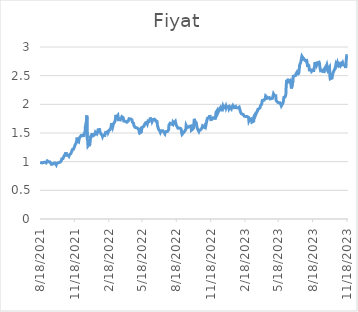
| Category | Fiyat |
|---|---|
| 8/18/21 | 0.988 |
| 8/20/21 | 0.982 |
| 8/23/21 | 0.978 |
| 8/24/21 | 0.989 |
| 8/25/21 | 0.993 |
| 8/26/21 | 0.986 |
| 8/27/21 | 0.979 |
| 8/31/21 | 0.991 |
| 9/1/21 | 0.984 |
| 9/2/21 | 0.992 |
| 9/3/21 | 0.979 |
| 9/6/21 | 1.014 |
| 9/7/21 | 1.01 |
| 9/8/21 | 0.998 |
| 9/9/21 | 0.999 |
| 9/13/21 | 0.996 |
| 9/14/21 | 0.993 |
| 9/15/21 | 0.993 |
| 9/17/21 | 0.953 |
| 9/20/21 | 0.954 |
| 9/21/21 | 0.957 |
| 9/22/21 | 0.964 |
| 9/23/21 | 0.974 |
| 9/24/21 | 0.968 |
| 9/27/21 | 0.977 |
| 9/28/21 | 0.988 |
| 9/29/21 | 0.981 |
| 9/30/21 | 0.945 |
| 10/1/21 | 0.967 |
| 10/4/21 | 0.978 |
| 10/5/21 | 0.983 |
| 10/6/21 | 0.983 |
| 10/7/21 | 0.984 |
| 10/8/21 | 0.988 |
| 10/11/21 | 0.994 |
| 10/12/21 | 0.997 |
| 10/13/21 | 1 |
| 10/14/21 | 1.023 |
| 10/15/21 | 1.05 |
| 10/18/21 | 1.053 |
| 10/19/21 | 1.053 |
| 10/20/21 | 1.083 |
| 10/21/21 | 1.102 |
| 10/22/21 | 1.093 |
| 10/25/21 | 1.14 |
| 10/26/21 | 1.164 |
| 10/27/21 | 1.111 |
| 10/28/21 | 1.113 |
| 11/1/21 | 1.113 |
| 11/2/21 | 1.114 |
| 11/3/21 | 1.094 |
| 11/4/21 | 1.099 |
| 11/5/21 | 1.126 |
| 11/8/21 | 1.138 |
| 11/9/21 | 1.151 |
| 11/10/21 | 1.147 |
| 11/11/21 | 1.186 |
| 11/12/21 | 1.21 |
| 11/15/21 | 1.215 |
| 11/16/21 | 1.216 |
| 11/17/21 | 1.23 |
| 11/18/21 | 1.263 |
| 11/19/21 | 1.287 |
| 11/22/21 | 1.32 |
| 11/23/21 | 1.316 |
| 11/24/21 | 1.367 |
| 11/25/21 | 1.42 |
| 11/26/21 | 1.36 |
| 11/29/21 | 1.346 |
| 11/30/21 | 1.388 |
| 12/1/21 | 1.415 |
| 12/2/21 | 1.431 |
| 12/3/21 | 1.431 |
| 12/6/21 | 1.458 |
| 12/7/21 | 1.462 |
| 12/8/21 | 1.464 |
| 12/9/21 | 1.452 |
| 12/10/21 | 1.443 |
| 12/13/21 | 1.455 |
| 12/14/21 | 1.506 |
| 12/15/21 | 1.479 |
| 12/16/21 | 1.505 |
| 12/17/21 | 1.607 |
| 12/20/21 | 1.714 |
| 12/21/21 | 1.807 |
| 12/22/21 | 1.41 |
| 12/23/21 | 1.367 |
| 12/24/21 | 1.274 |
| 12/27/21 | 1.302 |
| 12/28/21 | 1.271 |
| 12/29/21 | 1.319 |
| 12/30/21 | 1.35 |
| 12/31/21 | 1.434 |
| 1/3/22 | 1.476 |
| 1/4/22 | 1.484 |
| 1/5/22 | 1.46 |
| 1/6/22 | 1.476 |
| 1/7/22 | 1.452 |
| 1/10/22 | 1.465 |
| 1/11/22 | 1.474 |
| 1/12/22 | 1.491 |
| 1/13/22 | 1.514 |
| 1/14/22 | 1.498 |
| 1/17/22 | 1.485 |
| 1/18/22 | 1.484 |
| 1/19/22 | 1.517 |
| 1/20/22 | 1.556 |
| 1/21/22 | 1.573 |
| 1/24/22 | 1.56 |
| 1/25/22 | 1.523 |
| 1/26/22 | 1.537 |
| 1/27/22 | 1.534 |
| 1/28/22 | 1.483 |
| 1/31/22 | 1.461 |
| 2/1/22 | 1.441 |
| 2/2/22 | 1.46 |
| 2/3/22 | 1.462 |
| 2/4/22 | 1.453 |
| 2/7/22 | 1.458 |
| 2/8/22 | 1.489 |
| 2/9/22 | 1.508 |
| 2/10/22 | 1.505 |
| 2/11/22 | 1.516 |
| 2/14/22 | 1.5 |
| 2/15/22 | 1.542 |
| 2/16/22 | 1.514 |
| 2/17/22 | 1.53 |
| 2/18/22 | 1.545 |
| 2/21/22 | 1.555 |
| 2/22/22 | 1.554 |
| 2/23/22 | 1.587 |
| 2/24/22 | 1.609 |
| 2/25/22 | 1.67 |
| 2/28/22 | 1.604 |
| 3/1/22 | 1.606 |
| 3/2/22 | 1.657 |
| 3/3/22 | 1.669 |
| 3/4/22 | 1.677 |
| 3/7/22 | 1.716 |
| 3/8/22 | 1.73 |
| 3/9/22 | 1.815 |
| 3/10/22 | 1.779 |
| 3/11/22 | 1.794 |
| 3/14/22 | 1.809 |
| 3/15/22 | 1.748 |
| 3/16/22 | 1.728 |
| 3/17/22 | 1.709 |
| 3/18/22 | 1.748 |
| 3/21/22 | 1.735 |
| 3/22/22 | 1.757 |
| 3/23/22 | 1.727 |
| 3/24/22 | 1.742 |
| 3/25/22 | 1.783 |
| 3/28/22 | 1.77 |
| 3/29/22 | 1.744 |
| 3/30/22 | 1.708 |
| 3/31/22 | 1.714 |
| 4/1/22 | 1.716 |
| 4/4/22 | 1.704 |
| 4/5/22 | 1.693 |
| 4/6/22 | 1.687 |
| 4/7/22 | 1.688 |
| 4/8/22 | 1.693 |
| 4/11/22 | 1.707 |
| 4/12/22 | 1.723 |
| 4/13/22 | 1.749 |
| 4/14/22 | 1.752 |
| 4/15/22 | 1.742 |
| 4/18/22 | 1.744 |
| 4/19/22 | 1.75 |
| 4/20/22 | 1.726 |
| 4/21/22 | 1.725 |
| 4/22/22 | 1.691 |
| 4/25/22 | 1.67 |
| 4/26/22 | 1.632 |
| 4/27/22 | 1.626 |
| 4/28/22 | 1.618 |
| 4/29/22 | 1.599 |
| 5/5/22 | 1.588 |
| 5/6/22 | 1.572 |
| 5/9/22 | 1.564 |
| 5/10/22 | 1.532 |
| 5/11/22 | 1.527 |
| 5/12/22 | 1.55 |
| 5/13/22 | 1.504 |
| 5/16/22 | 1.517 |
| 5/17/22 | 1.566 |
| 5/18/22 | 1.598 |
| 5/20/22 | 1.597 |
| 5/23/22 | 1.619 |
| 5/24/22 | 1.611 |
| 5/25/22 | 1.655 |
| 5/26/22 | 1.671 |
| 5/27/22 | 1.677 |
| 5/30/22 | 1.685 |
| 5/31/22 | 1.682 |
| 6/1/22 | 1.657 |
| 6/2/22 | 1.674 |
| 6/3/22 | 1.709 |
| 6/6/22 | 1.703 |
| 6/7/22 | 1.72 |
| 6/8/22 | 1.737 |
| 6/9/22 | 1.768 |
| 6/10/22 | 1.747 |
| 6/13/22 | 1.737 |
| 6/14/22 | 1.704 |
| 6/15/22 | 1.687 |
| 6/16/22 | 1.733 |
| 6/17/22 | 1.749 |
| 6/20/22 | 1.741 |
| 6/21/22 | 1.738 |
| 6/22/22 | 1.748 |
| 6/23/22 | 1.724 |
| 6/24/22 | 1.704 |
| 6/27/22 | 1.7 |
| 6/28/22 | 1.638 |
| 6/29/22 | 1.61 |
| 6/30/22 | 1.602 |
| 7/1/22 | 1.566 |
| 7/4/22 | 1.541 |
| 7/5/22 | 1.545 |
| 7/6/22 | 1.509 |
| 7/7/22 | 1.521 |
| 7/8/22 | 1.537 |
| 7/13/22 | 1.538 |
| 7/14/22 | 1.54 |
| 7/18/22 | 1.486 |
| 7/19/22 | 1.512 |
| 7/20/22 | 1.52 |
| 7/21/22 | 1.523 |
| 7/22/22 | 1.528 |
| 7/25/22 | 1.527 |
| 7/26/22 | 1.512 |
| 7/27/22 | 1.535 |
| 7/28/22 | 1.556 |
| 7/29/22 | 1.639 |
| 8/1/22 | 1.67 |
| 8/2/22 | 1.677 |
| 8/3/22 | 1.661 |
| 8/4/22 | 1.658 |
| 8/5/22 | 1.668 |
| 8/8/22 | 1.645 |
| 8/9/22 | 1.696 |
| 8/10/22 | 1.689 |
| 8/11/22 | 1.694 |
| 8/12/22 | 1.676 |
| 8/15/22 | 1.703 |
| 8/16/22 | 1.673 |
| 8/17/22 | 1.659 |
| 8/18/22 | 1.631 |
| 8/19/22 | 1.624 |
| 8/22/22 | 1.583 |
| 8/23/22 | 1.577 |
| 8/24/22 | 1.585 |
| 8/25/22 | 1.586 |
| 8/26/22 | 1.595 |
| 8/29/22 | 1.58 |
| 8/31/22 | 1.557 |
| 9/1/22 | 1.499 |
| 9/2/22 | 1.475 |
| 9/5/22 | 1.499 |
| 9/6/22 | 1.5 |
| 9/7/22 | 1.498 |
| 9/8/22 | 1.521 |
| 9/9/22 | 1.535 |
| 9/12/22 | 1.56 |
| 9/13/22 | 1.634 |
| 9/14/22 | 1.618 |
| 9/15/22 | 1.623 |
| 9/16/22 | 1.595 |
| 9/19/22 | 1.602 |
| 9/20/22 | 1.614 |
| 9/21/22 | 1.596 |
| 9/22/22 | 1.618 |
| 9/23/22 | 1.623 |
| 9/26/22 | 1.623 |
| 9/27/22 | 1.547 |
| 9/28/22 | 1.54 |
| 9/29/22 | 1.559 |
| 9/30/22 | 1.562 |
| 10/3/22 | 1.59 |
| 10/4/22 | 1.702 |
| 10/5/22 | 1.747 |
| 10/6/22 | 1.706 |
| 10/7/22 | 1.714 |
| 10/10/22 | 1.679 |
| 10/11/22 | 1.638 |
| 10/12/22 | 1.6 |
| 10/13/22 | 1.585 |
| 10/14/22 | 1.563 |
| 10/17/22 | 1.527 |
| 10/18/22 | 1.544 |
| 10/19/22 | 1.554 |
| 10/20/22 | 1.537 |
| 10/21/22 | 1.551 |
| 10/24/22 | 1.577 |
| 10/25/22 | 1.591 |
| 10/26/22 | 1.599 |
| 10/27/22 | 1.623 |
| 10/28/22 | 1.623 |
| 10/31/22 | 1.602 |
| 11/1/22 | 1.591 |
| 11/2/22 | 1.63 |
| 11/3/22 | 1.614 |
| 11/4/22 | 1.608 |
| 11/7/22 | 1.705 |
| 11/8/22 | 1.72 |
| 11/9/22 | 1.757 |
| 11/10/22 | 1.746 |
| 11/11/22 | 1.746 |
| 11/14/22 | 1.777 |
| 11/15/22 | 1.811 |
| 11/16/22 | 1.789 |
| 11/17/22 | 1.78 |
| 11/18/22 | 1.734 |
| 11/21/22 | 1.738 |
| 11/22/22 | 1.722 |
| 11/23/22 | 1.742 |
| 11/24/22 | 1.766 |
| 11/25/22 | 1.779 |
| 11/28/22 | 1.767 |
| 11/29/22 | 1.736 |
| 11/30/22 | 1.757 |
| 12/1/22 | 1.805 |
| 12/2/22 | 1.86 |
| 12/5/22 | 1.892 |
| 12/6/22 | 1.836 |
| 12/7/22 | 1.831 |
| 12/8/22 | 1.864 |
| 12/9/22 | 1.89 |
| 12/12/22 | 1.921 |
| 12/13/22 | 1.911 |
| 12/14/22 | 1.943 |
| 12/15/22 | 1.958 |
| 12/16/22 | 1.902 |
| 12/19/22 | 1.9 |
| 12/20/22 | 1.888 |
| 12/21/22 | 1.967 |
| 12/22/22 | 1.96 |
| 12/23/22 | 1.936 |
| 12/26/22 | 1.945 |
| 12/27/22 | 1.949 |
| 12/28/22 | 1.972 |
| 12/29/22 | 1.942 |
| 12/30/22 | 1.96 |
| 1/2/23 | 1.956 |
| 1/3/23 | 1.961 |
| 1/4/23 | 1.973 |
| 1/5/23 | 1.965 |
| 1/6/23 | 1.919 |
| 1/9/23 | 1.947 |
| 1/10/23 | 1.952 |
| 1/11/23 | 1.943 |
| 1/12/23 | 1.922 |
| 1/13/23 | 1.947 |
| 1/16/23 | 1.981 |
| 1/17/23 | 1.986 |
| 1/18/23 | 1.966 |
| 1/19/23 | 1.946 |
| 1/20/23 | 1.946 |
| 1/23/23 | 1.962 |
| 1/24/23 | 1.919 |
| 1/25/23 | 1.943 |
| 1/26/23 | 1.949 |
| 1/27/23 | 1.96 |
| 1/30/23 | 1.938 |
| 1/31/23 | 1.941 |
| 2/1/23 | 1.94 |
| 2/2/23 | 1.952 |
| 2/3/23 | 1.944 |
| 2/6/23 | 1.858 |
| 2/7/23 | 1.848 |
| 2/8/23 | 1.835 |
| 2/9/23 | 1.842 |
| 2/10/23 | 1.827 |
| 2/13/23 | 1.823 |
| 2/14/23 | 1.818 |
| 2/15/23 | 1.81 |
| 2/16/23 | 1.791 |
| 2/17/23 | 1.789 |
| 2/20/23 | 1.789 |
| 2/21/23 | 1.801 |
| 2/22/23 | 1.805 |
| 2/23/23 | 1.788 |
| 2/24/23 | 1.774 |
| 2/27/23 | 1.774 |
| 2/28/23 | 1.712 |
| 3/1/23 | 1.728 |
| 3/2/23 | 1.741 |
| 3/3/23 | 1.729 |
| 3/6/23 | 1.749 |
| 3/7/23 | 1.743 |
| 3/8/23 | 1.688 |
| 3/9/23 | 1.671 |
| 3/10/23 | 1.677 |
| 3/13/23 | 1.707 |
| 3/14/23 | 1.796 |
| 3/15/23 | 1.802 |
| 3/16/23 | 1.818 |
| 3/17/23 | 1.797 |
| 3/20/23 | 1.846 |
| 3/21/23 | 1.86 |
| 3/22/23 | 1.846 |
| 3/23/23 | 1.885 |
| 3/24/23 | 1.913 |
| 3/27/23 | 1.922 |
| 3/28/23 | 1.917 |
| 3/29/23 | 1.929 |
| 3/30/23 | 1.941 |
| 3/31/23 | 1.976 |
| 4/3/23 | 1.998 |
| 4/4/23 | 2.002 |
| 4/5/23 | 2.067 |
| 4/6/23 | 2.075 |
| 4/7/23 | 2.072 |
| 4/10/23 | 2.074 |
| 4/11/23 | 2.073 |
| 4/12/23 | 2.088 |
| 4/13/23 | 2.109 |
| 4/14/23 | 2.146 |
| 4/17/23 | 2.126 |
| 4/18/23 | 2.106 |
| 4/19/23 | 2.112 |
| 4/20/23 | 2.117 |
| 4/24/23 | 2.118 |
| 4/25/23 | 2.109 |
| 4/26/23 | 2.094 |
| 4/27/23 | 2.099 |
| 4/28/23 | 2.097 |
| 5/2/23 | 2.104 |
| 5/3/23 | 2.127 |
| 5/4/23 | 2.142 |
| 5/5/23 | 2.183 |
| 5/8/23 | 2.15 |
| 5/9/23 | 2.16 |
| 5/10/23 | 2.155 |
| 5/11/23 | 2.15 |
| 5/12/23 | 2.067 |
| 5/15/23 | 2.043 |
| 5/16/23 | 2.043 |
| 5/17/23 | 2.028 |
| 5/18/23 | 2.027 |
| 5/22/23 | 2.027 |
| 5/23/23 | 2.032 |
| 5/24/23 | 2.015 |
| 5/25/23 | 1.993 |
| 5/26/23 | 1.973 |
| 5/29/23 | 2.007 |
| 5/30/23 | 2.012 |
| 5/31/23 | 2.036 |
| 6/1/23 | 2.091 |
| 6/2/23 | 2.123 |
| 6/5/23 | 2.129 |
| 6/6/23 | 2.144 |
| 6/7/23 | 2.168 |
| 6/8/23 | 2.321 |
| 6/9/23 | 2.407 |
| 6/12/23 | 2.422 |
| 6/13/23 | 2.413 |
| 6/14/23 | 2.393 |
| 6/15/23 | 2.402 |
| 6/16/23 | 2.387 |
| 6/19/23 | 2.419 |
| 6/20/23 | 2.418 |
| 6/21/23 | 2.418 |
| 6/22/23 | 2.276 |
| 6/23/23 | 2.268 |
| 6/26/23 | 2.406 |
| 6/27/23 | 2.49 |
| 7/3/23 | 2.502 |
| 7/4/23 | 2.528 |
| 7/5/23 | 2.533 |
| 7/6/23 | 2.552 |
| 7/7/23 | 2.528 |
| 7/10/23 | 2.527 |
| 7/11/23 | 2.538 |
| 7/12/23 | 2.555 |
| 7/13/23 | 2.614 |
| 7/14/23 | 2.688 |
| 7/17/23 | 2.734 |
| 7/18/23 | 2.735 |
| 7/19/23 | 2.809 |
| 7/20/23 | 2.839 |
| 7/21/23 | 2.835 |
| 7/24/23 | 2.798 |
| 7/25/23 | 2.764 |
| 7/26/23 | 2.787 |
| 7/27/23 | 2.788 |
| 7/28/23 | 2.78 |
| 7/31/23 | 2.75 |
| 8/1/23 | 2.789 |
| 8/2/23 | 2.764 |
| 8/3/23 | 2.729 |
| 8/4/23 | 2.678 |
| 8/7/23 | 2.681 |
| 8/8/23 | 2.662 |
| 8/9/23 | 2.6 |
| 8/10/23 | 2.596 |
| 8/11/23 | 2.599 |
| 8/14/23 | 2.598 |
| 8/15/23 | 2.575 |
| 8/16/23 | 2.564 |
| 8/17/23 | 2.582 |
| 8/18/23 | 2.594 |
| 8/21/23 | 2.591 |
| 8/22/23 | 2.639 |
| 8/23/23 | 2.663 |
| 8/24/23 | 2.737 |
| 8/25/23 | 2.724 |
| 8/28/23 | 2.676 |
| 8/29/23 | 2.688 |
| 8/31/23 | 2.724 |
| 9/1/23 | 2.742 |
| 9/4/23 | 2.735 |
| 9/5/23 | 2.716 |
| 9/6/23 | 2.66 |
| 9/7/23 | 2.619 |
| 9/8/23 | 2.588 |
| 9/11/23 | 2.595 |
| 9/12/23 | 2.604 |
| 9/13/23 | 2.593 |
| 9/14/23 | 2.591 |
| 9/15/23 | 2.55 |
| 9/18/23 | 2.617 |
| 9/19/23 | 2.616 |
| 9/20/23 | 2.633 |
| 9/21/23 | 2.648 |
| 9/22/23 | 2.626 |
| 9/25/23 | 2.685 |
| 9/26/23 | 2.669 |
| 9/27/23 | 2.625 |
| 9/28/23 | 2.596 |
| 9/29/23 | 2.599 |
| 10/2/23 | 2.642 |
| 10/3/23 | 2.482 |
| 10/4/23 | 2.444 |
| 10/5/23 | 2.428 |
| 10/6/23 | 2.428 |
| 10/9/23 | 2.46 |
| 10/10/23 | 2.52 |
| 10/11/23 | 2.528 |
| 10/12/23 | 2.559 |
| 10/13/23 | 2.554 |
| 10/16/23 | 2.615 |
| 10/17/23 | 2.63 |
| 10/18/23 | 2.656 |
| 10/19/23 | 2.69 |
| 10/20/23 | 2.672 |
| 10/23/23 | 2.727 |
| 10/24/23 | 2.702 |
| 10/25/23 | 2.684 |
| 10/26/23 | 2.68 |
| 10/27/23 | 2.664 |
| 10/30/23 | 2.679 |
| 10/31/23 | 2.74 |
| 11/1/23 | 2.723 |
| 11/2/23 | 2.688 |
| 11/3/23 | 2.704 |
| 11/6/23 | 2.73 |
| 11/7/23 | 2.744 |
| 11/8/23 | 2.685 |
| 11/9/23 | 2.685 |
| 11/10/23 | 2.69 |
| 11/13/23 | 2.679 |
| 11/14/23 | 2.633 |
| 11/15/23 | 2.707 |
| 11/16/23 | 2.787 |
| 11/17/23 | 2.848 |
| 11/20/23 | 2.846 |